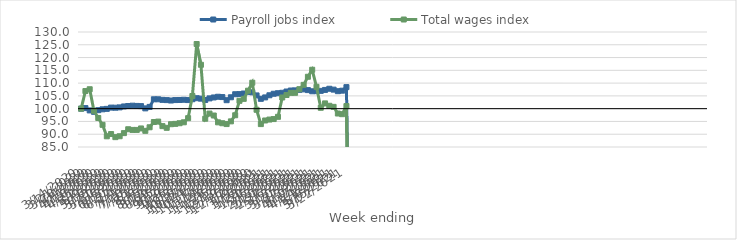
| Category | Payroll jobs index | Total wages index |
|---|---|---|
| 14/03/2020 | 100 | 100 |
| 21/03/2020 | 100.219 | 106.892 |
| 28/03/2020 | 99.313 | 107.6 |
| 04/04/2020 | 98.775 | 99.156 |
| 11/04/2020 | 99.41 | 96.349 |
| 18/04/2020 | 99.751 | 93.678 |
| 25/04/2020 | 99.92 | 89.186 |
| 02/05/2020 | 100.417 | 90.069 |
| 09/05/2020 | 100.374 | 88.858 |
| 16/05/2020 | 100.5 | 89.212 |
| 23/05/2020 | 100.867 | 90.432 |
| 30/05/2020 | 101.04 | 91.948 |
| 06/06/2020 | 101.166 | 91.687 |
| 13/06/2020 | 101.069 | 91.685 |
| 20/06/2020 | 101.003 | 92.259 |
| 27/06/2020 | 100.114 | 91.33 |
| 04/07/2020 | 100.691 | 92.717 |
| 11/07/2020 | 103.671 | 94.781 |
| 18/07/2020 | 103.668 | 94.947 |
| 25/07/2020 | 103.444 | 93.166 |
| 01/08/2020 | 103.351 | 92.502 |
| 08/08/2020 | 103.187 | 93.92 |
| 15/08/2020 | 103.365 | 94.048 |
| 22/08/2020 | 103.396 | 94.304 |
| 29/08/2020 | 103.483 | 94.67 |
| 05/09/2020 | 103.367 | 96.286 |
| 12/09/2020 | 103.695 | 104.956 |
| 19/09/2020 | 104.099 | 125.301 |
| 26/09/2020 | 103.916 | 117.176 |
| 03/10/2020 | 103.393 | 96.061 |
| 10/10/2020 | 104.026 | 98.081 |
| 17/10/2020 | 104.385 | 97.325 |
| 24/10/2020 | 104.658 | 94.654 |
| 31/10/2020 | 104.536 | 94.299 |
| 07/11/2020 | 103.312 | 93.973 |
| 14/11/2020 | 104.458 | 95.029 |
| 21/11/2020 | 105.652 | 97.427 |
| 28/11/2020 | 105.702 | 103.079 |
| 05/12/2020 | 105.929 | 103.833 |
| 12/12/2020 | 106.575 | 107.029 |
| 19/12/2020 | 106.398 | 110.158 |
| 26/12/2020 | 105.184 | 99.572 |
| 02/01/2021 | 103.845 | 93.963 |
| 09/01/2021 | 104.402 | 95.379 |
| 16/01/2021 | 105.238 | 95.737 |
| 23/01/2021 | 105.832 | 95.926 |
| 30/01/2021 | 106.048 | 96.807 |
| 06/02/2021 | 106.211 | 104.377 |
| 13/02/2021 | 106.716 | 105.346 |
| 20/02/2021 | 107.098 | 106.179 |
| 27/02/2021 | 107.16 | 106.202 |
| 06/03/2021 | 107.372 | 107.616 |
| 13/03/2021 | 107.545 | 109.321 |
| 20/03/2021 | 107.265 | 112.484 |
| 27/03/2021 | 106.807 | 115.229 |
| 03/04/2021 | 106.852 | 108.556 |
| 10/04/2021 | 106.962 | 100.347 |
| 17/04/2021 | 107.332 | 102.063 |
| 24/04/2021 | 107.792 | 101.133 |
| 01/05/2021 | 107.445 | 100.704 |
| 08/05/2021 | 106.843 | 98.102 |
| 15/05/2021 | 107.04 | 97.842 |
| 22/05/2021 | 108.418 | 101.016 |